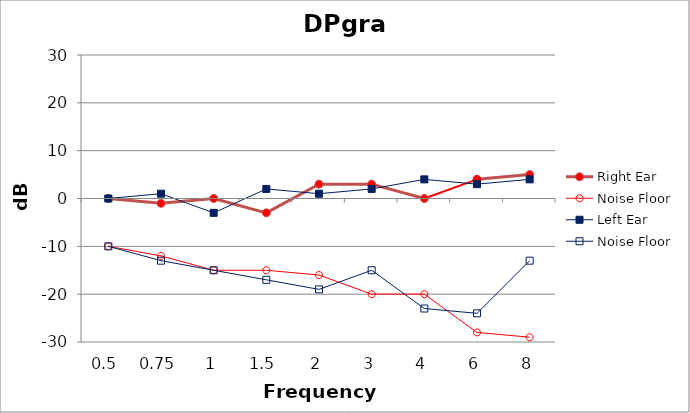
| Category | Right Ear | Noise Floor | Left Ear |
|---|---|---|---|
| 0.5 | 0 | -10 | 0 |
| 0.75 | -1 | -13 | 1 |
| 1.0 | 0 | -15 | -3 |
| 1.5 | -3 | -17 | 2 |
| 2.0 | 3 | -19 | 1 |
| 3.0 | 3 | -15 | 2 |
| 4.0 | 0 | -23 | 4 |
| 6.0 | 4 | -24 | 3 |
| 8.0 | 5 | -13 | 4 |